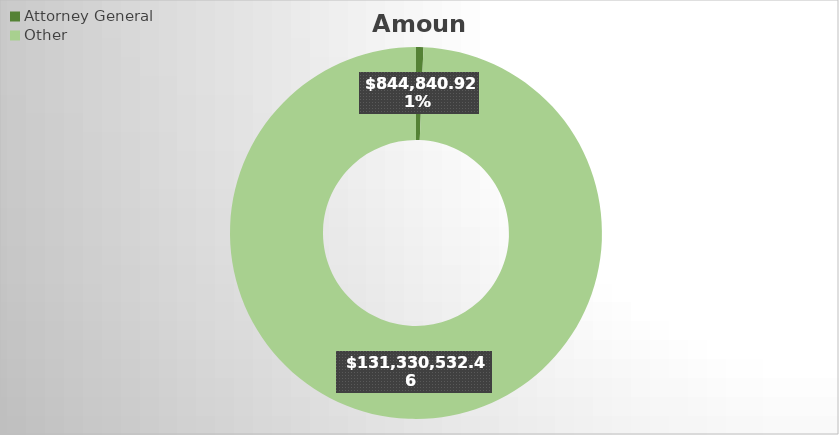
| Category | Amount |
|---|---|
| Attorney General | 844840.92 |
| Other | 131330532.46 |